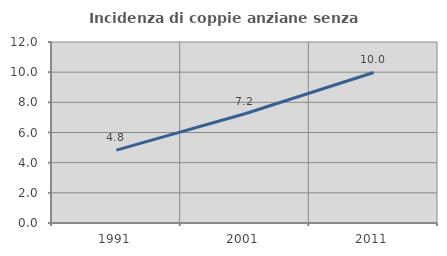
| Category | Incidenza di coppie anziane senza figli  |
|---|---|
| 1991.0 | 4.829 |
| 2001.0 | 7.243 |
| 2011.0 | 9.981 |